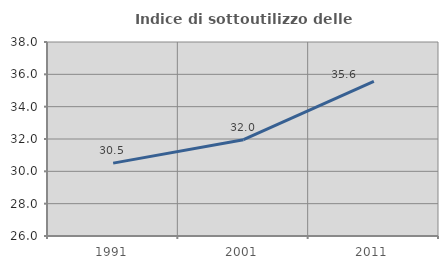
| Category | Indice di sottoutilizzo delle abitazioni  |
|---|---|
| 1991.0 | 30.508 |
| 2001.0 | 31.956 |
| 2011.0 | 35.561 |